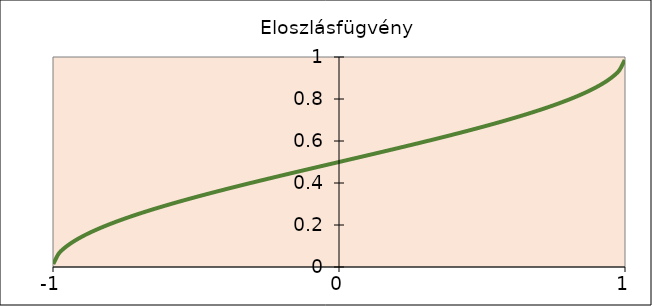
| Category | Series 0 |
|---|---|
| -0.999 | 0.014 |
| -0.98 | 0.064 |
| -0.96 | 0.09 |
| -0.94 | 0.111 |
| -0.92 | 0.128 |
| -0.9 | 0.144 |
| -0.88 | 0.158 |
| -0.86 | 0.17 |
| -0.84 | 0.183 |
| -0.82 | 0.194 |
| -0.8 | 0.205 |
| -0.78 | 0.215 |
| -0.76 | 0.225 |
| -0.74 | 0.235 |
| -0.72 | 0.244 |
| -0.7 | 0.253 |
| -0.68 | 0.262 |
| -0.66 | 0.271 |
| -0.64 | 0.279 |
| -0.62 | 0.287 |
| -0.6 | 0.295 |
| -0.58 | 0.303 |
| -0.56 | 0.311 |
| -0.54 | 0.318 |
| -0.52 | 0.326 |
| -0.5 | 0.333 |
| -0.48 | 0.341 |
| -0.46 | 0.348 |
| -0.44 | 0.355 |
| -0.419999999999999 | 0.362 |
| -0.399999999999999 | 0.369 |
| -0.379999999999999 | 0.376 |
| -0.359999999999999 | 0.383 |
| -0.339999999999999 | 0.39 |
| -0.319999999999999 | 0.396 |
| -0.299999999999999 | 0.403 |
| -0.279999999999999 | 0.41 |
| -0.259999999999999 | 0.416 |
| -0.239999999999999 | 0.423 |
| -0.219999999999999 | 0.429 |
| -0.199999999999999 | 0.436 |
| -0.179999999999999 | 0.442 |
| -0.159999999999999 | 0.449 |
| -0.139999999999999 | 0.455 |
| -0.119999999999999 | 0.462 |
| -0.099999999999999 | 0.468 |
| -0.079999999999999 | 0.475 |
| -0.0599999999999991 | 0.481 |
| -0.039999999999999 | 0.487 |
| -0.019999999999999 | 0.494 |
| 0.0 | 0.5 |
| 0.02 | 0.506 |
| 0.04 | 0.513 |
| 0.0600000000000001 | 0.519 |
| 0.0800000000000001 | 0.525 |
| 0.1 | 0.532 |
| 0.12 | 0.538 |
| 0.14 | 0.545 |
| 0.16 | 0.551 |
| 0.18 | 0.558 |
| 0.2 | 0.564 |
| 0.22 | 0.571 |
| 0.24 | 0.577 |
| 0.26 | 0.584 |
| 0.28 | 0.59 |
| 0.3 | 0.597 |
| 0.32 | 0.604 |
| 0.34 | 0.61 |
| 0.36 | 0.617 |
| 0.38 | 0.624 |
| 0.4 | 0.631 |
| 0.42 | 0.638 |
| 0.44 | 0.645 |
| 0.46 | 0.652 |
| 0.48 | 0.659 |
| 0.5 | 0.667 |
| 0.52 | 0.674 |
| 0.54 | 0.682 |
| 0.56 | 0.689 |
| 0.58 | 0.697 |
| 0.6 | 0.705 |
| 0.62 | 0.713 |
| 0.64 | 0.721 |
| 0.66 | 0.729 |
| 0.68 | 0.738 |
| 0.7 | 0.747 |
| 0.72 | 0.756 |
| 0.74 | 0.765 |
| 0.76 | 0.775 |
| 0.78 | 0.785 |
| 0.8 | 0.795 |
| 0.82 | 0.806 |
| 0.84 | 0.817 |
| 0.86 | 0.83 |
| 0.88 | 0.842 |
| 0.9 | 0.856 |
| 0.92 | 0.872 |
| 0.94 | 0.889 |
| 0.96 | 0.91 |
| 0.98 | 0.936 |
| 0.999 | 0.986 |